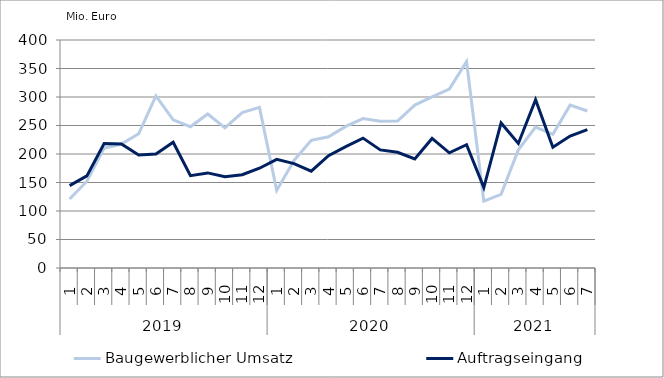
| Category | Baugewerblicher Umsatz | Auftragseingang |
|---|---|---|
| 0 | 120975.133 | 144510.881 |
| 1 | 152329.786 | 161685.201 |
| 2 | 210227.67 | 218455.879 |
| 3 | 217522.321 | 217610.064 |
| 4 | 235490.429 | 198110.439 |
| 5 | 301963.302 | 200012.086 |
| 6 | 259975.317 | 220559.061 |
| 7 | 247779.658 | 162059.723 |
| 8 | 270249.609 | 166829.611 |
| 9 | 245966.91 | 160120.773 |
| 10 | 272620.351 | 163589.389 |
| 11 | 281810.121 | 175051.247 |
| 12 | 136135.432 | 190647.086 |
| 13 | 188682.361 | 183141.14 |
| 14 | 224009.315 | 169770.009 |
| 15 | 230172.252 | 196979.845 |
| 16 | 248410.714 | 212955.83 |
| 17 | 262078.128 | 227853.487 |
| 18 | 257360.37 | 207209.188 |
| 19 | 257932.168 | 202976.091 |
| 20 | 285866.269 | 191463.844 |
| 21 | 300164.57 | 227245.467 |
| 22 | 313922.518 | 202060.636 |
| 23 | 362040.738 | 216296.504 |
| 24 | 117421.805 | 141020.655 |
| 25 | 129162.55 | 254416.876 |
| 26 | 207280.837 | 218451.405 |
| 27 | 247094.279 | 295077.868 |
| 28 | 234515.312 | 211696.129 |
| 29 | 285732.845 | 231455.155 |
| 30 | 275480.885 | 242932.505 |